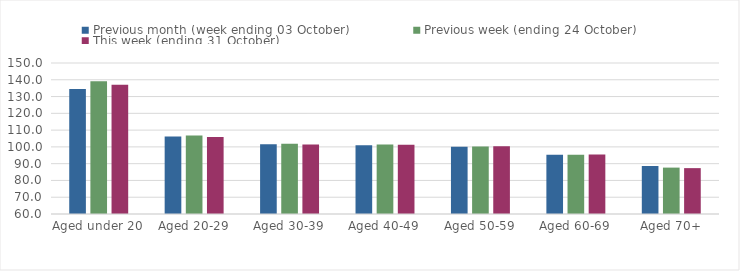
| Category | Previous month (week ending 03 October) | Previous week (ending 24 October) | This week (ending 31 October) |
|---|---|---|---|
| Aged under 20 | 134.43 | 139.06 | 137.1 |
| Aged 20-29 | 106.15 | 106.84 | 105.83 |
| Aged 30-39 | 101.55 | 101.92 | 101.44 |
| Aged 40-49 | 100.91 | 101.38 | 101.34 |
| Aged 50-59 | 100.01 | 100.25 | 100.31 |
| Aged 60-69 | 95.34 | 95.31 | 95.42 |
| Aged 70+ | 88.62 | 87.65 | 87.34 |